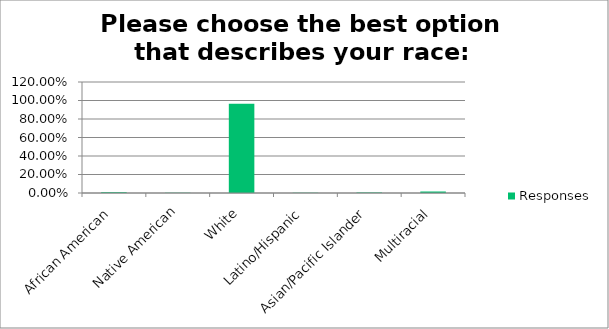
| Category | Responses |
|---|---|
| African American | 0.009 |
| Native American | 0.003 |
| White | 0.964 |
| Latino/Hispanic | 0.003 |
| Asian/Pacific Islander | 0.005 |
| Multiracial | 0.016 |